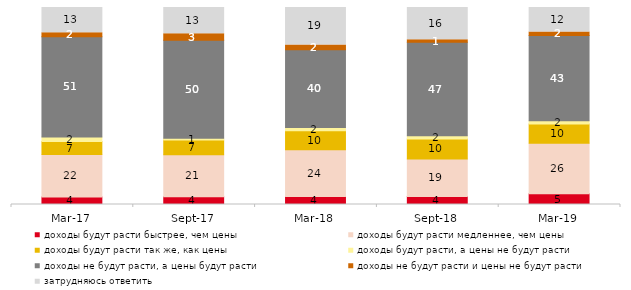
| Category | доходы будут расти быстрее, чем цены | доходы будут расти медленнее, чем цены | доходы будут расти так же, как цены | доходы будут расти, а цены не будут расти | доходы не будут расти, а цены будут расти | доходы не будут расти и цены не будут расти | затрудняюсь ответить |
|---|---|---|---|---|---|---|---|
| 2017-03-01 | 3.75 | 21.6 | 6.65 | 2.3 | 50.9 | 2 | 12.8 |
| 2017-09-01 | 3.95 | 21.3 | 7.45 | 0.9 | 49.75 | 3.3 | 13.35 |
| 2018-03-01 | 4 | 23.8 | 9.7 | 1.55 | 39.5 | 2.4 | 19.05 |
| 2018-09-01 | 4.05 | 19.1 | 10.05 | 1.75 | 47.35 | 1.3 | 16.4 |
| 2019-03-01 | 5.42 | 25.709 | 9.796 | 1.542 | 43.312 | 1.79 | 12.432 |